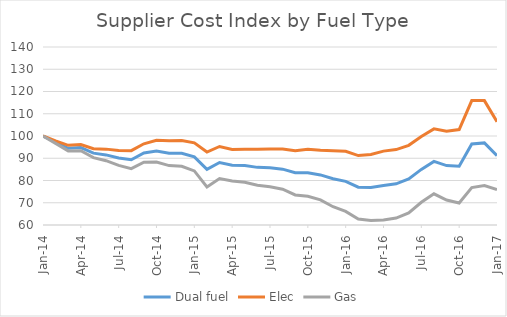
| Category | Dual fuel | Elec | Gas |
|---|---|---|---|
| 2014-01-01 | 100 | 100 | 100 |
| 2014-02-01 | 97.2 | 97.8 | 96.7 |
| 2014-03-01 | 94.5 | 95.8 | 93.3 |
| 2014-04-01 | 94.8 | 96.2 | 93.4 |
| 2014-05-01 | 92.3 | 94.3 | 90.3 |
| 2014-06-01 | 91.5 | 94.1 | 88.9 |
| 2014-07-01 | 90.1 | 93.5 | 86.8 |
| 2014-08-01 | 89.3 | 93.4 | 85.3 |
| 2014-09-01 | 92.4 | 96.5 | 88.2 |
| 2014-10-01 | 93.2 | 98.1 | 88.3 |
| 2014-11-01 | 92.3 | 97.9 | 86.7 |
| 2014-12-01 | 92.2 | 98 | 86.4 |
| 2015-01-01 | 90.6 | 96.9 | 84.3 |
| 2015-02-01 | 85 | 92.8 | 77.1 |
| 2015-03-01 | 88.1 | 95.3 | 80.9 |
| 2015-04-01 | 86.9 | 93.9 | 79.8 |
| 2015-05-01 | 86.7 | 94.1 | 79.2 |
| 2015-06-01 | 85.9 | 94 | 77.9 |
| 2015-07-01 | 85.7 | 94.2 | 77.2 |
| 2015-08-01 | 85.1 | 94.2 | 76.1 |
| 2015-09-01 | 83.5 | 93.4 | 73.5 |
| 2015-10-01 | 83.5 | 94 | 72.9 |
| 2015-11-01 | 82.5 | 93.6 | 71.3 |
| 2015-12-01 | 80.8 | 93.4 | 68.2 |
| 2016-01-01 | 79.6 | 93.1 | 66.1 |
| 2016-02-01 | 77 | 91.2 | 62.7 |
| 2016-03-01 | 76.9 | 91.7 | 62 |
| 2016-04-01 | 77.8 | 93.2 | 62.3 |
| 2016-05-01 | 78.5 | 93.9 | 63.1 |
| 2016-06-01 | 80.7 | 95.8 | 65.4 |
| 2016-07-01 | 85 | 99.8 | 70.2 |
| 2016-08-01 | 88.6 | 103.2 | 74 |
| 2016-09-01 | 86.7 | 102.1 | 71.2 |
| 2016-10-01 | 86.4 | 102.9 | 69.9 |
| 2016-11-01 | 96.4 | 115.9 | 76.8 |
| 2016-12-01 | 96.9 | 115.9 | 77.7 |
| 2017-01-01 | 91.2 | 106.4 | 75.9 |